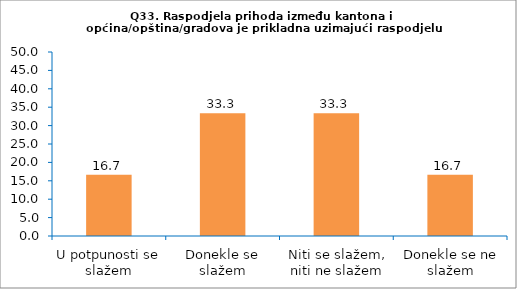
| Category | Series 0 |
|---|---|
| U potpunosti se slažem | 16.667 |
| Donekle se slažem | 33.333 |
| Niti se slažem, niti ne slažem | 33.333 |
| Donekle se ne slažem | 16.667 |